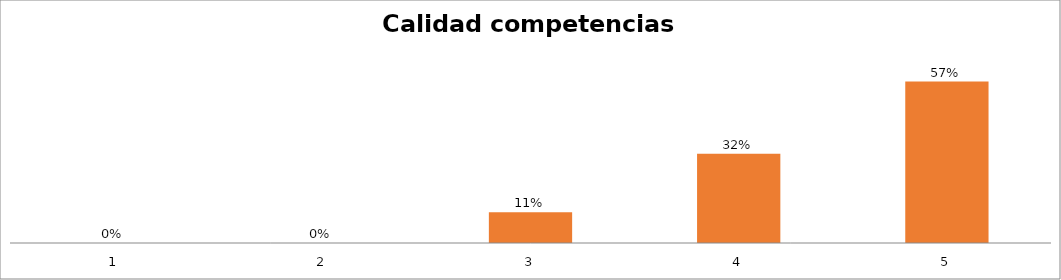
| Category | Series 1 |
|---|---|
| 0 | 0 |
| 1 | 0 |
| 2 | 0.109 |
| 3 | 0.317 |
| 4 | 0.574 |